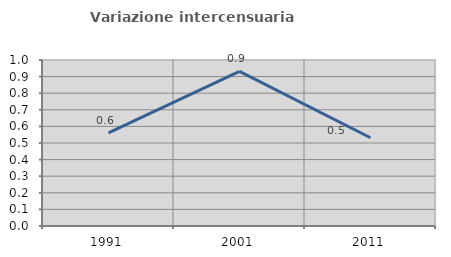
| Category | Variazione intercensuaria annua |
|---|---|
| 1991.0 | 0.561 |
| 2001.0 | 0.931 |
| 2011.0 | 0.532 |